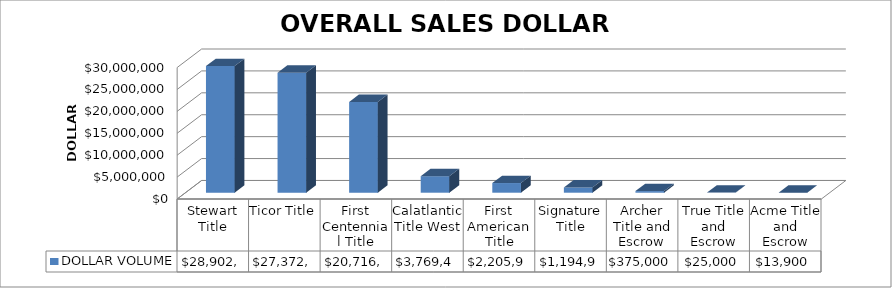
| Category | DOLLAR VOLUME |
|---|---|
| Stewart Title | 28902095.24 |
| Ticor Title | 27372171 |
| First Centennial Title | 20716704 |
| Calatlantic Title West | 3769450 |
| First American Title | 2205900 |
| Signature Title | 1194900 |
| Archer Title and Escrow | 375000 |
| True Title and Escrow | 25000 |
| Acme Title and Escrow | 13900 |